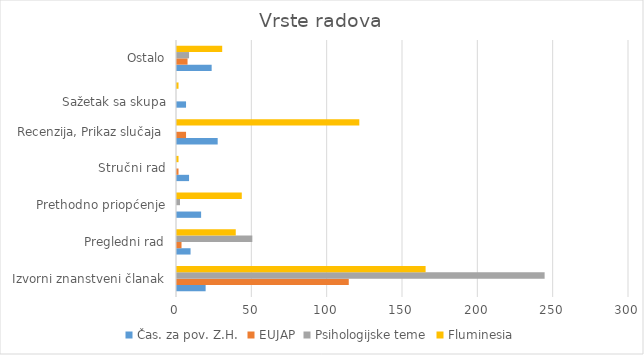
| Category | Čas. za pov. Z.H. | EUJAP | Psihologijske teme | Fluminesia |
|---|---|---|---|---|
| Izvorni znanstveni članak | 19 | 114 | 244 | 165 |
| Pregledni rad | 9 | 3 | 50 | 39 |
| Prethodno priopćenje | 16 | 0 | 2 | 43 |
| Stručni rad | 8 | 1 | 0 | 1 |
| Recenzija, Prikaz slučaja | 27 | 6 | 0 | 121 |
| 
Sažetak sa skupa | 6 | 0 | 0 | 1 |
| Ostalo | 23 | 7 | 8 | 30 |